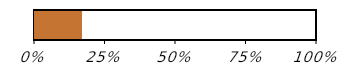
| Category | Напредък с покупките (1 от 6) |
|---|---|
| Купени | 0.167 |